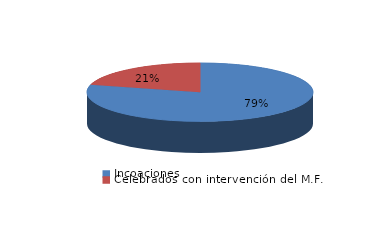
| Category | Series 0 |
|---|---|
| Incoaciones | 6157 |
| Celebrados con intervención del M.F. | 1624 |